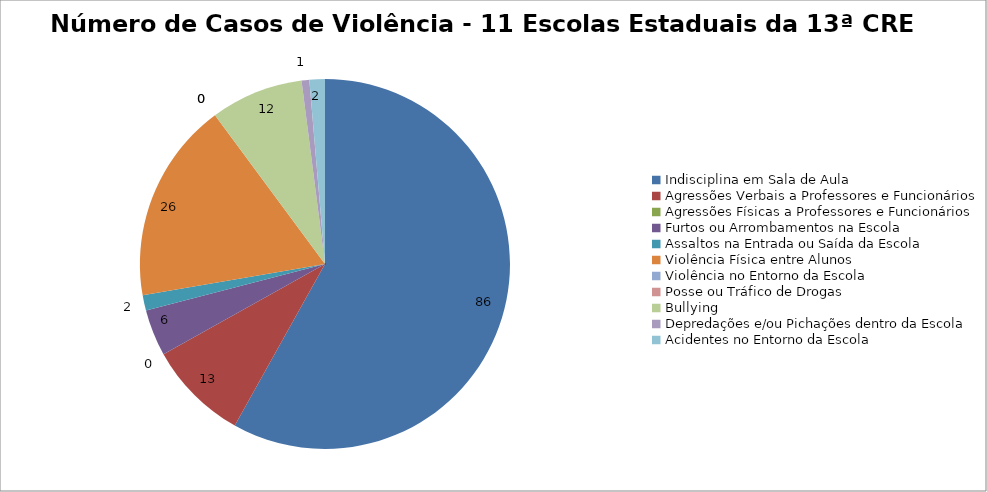
| Category | Número de Casos |
|---|---|
| Indisciplina em Sala de Aula | 86 |
| Agressões Verbais a Professores e Funcionários | 13 |
| Agressões Físicas a Professores e Funcionários | 0 |
| Furtos ou Arrombamentos na Escola | 6 |
| Assaltos na Entrada ou Saída da Escola | 2 |
| Violência Física entre Alunos | 26 |
| Violência no Entorno da Escola | 0 |
| Posse ou Tráfico de Drogas | 0 |
| Bullying | 12 |
| Depredações e/ou Pichações dentro da Escola | 1 |
| Acidentes no Entorno da Escola | 2 |